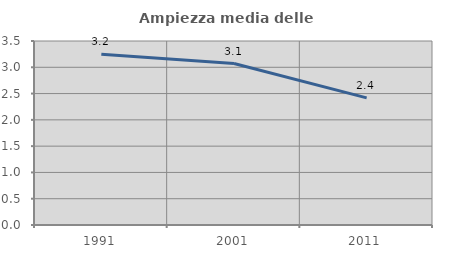
| Category | Ampiezza media delle famiglie |
|---|---|
| 1991.0 | 3.248 |
| 2001.0 | 3.071 |
| 2011.0 | 2.419 |